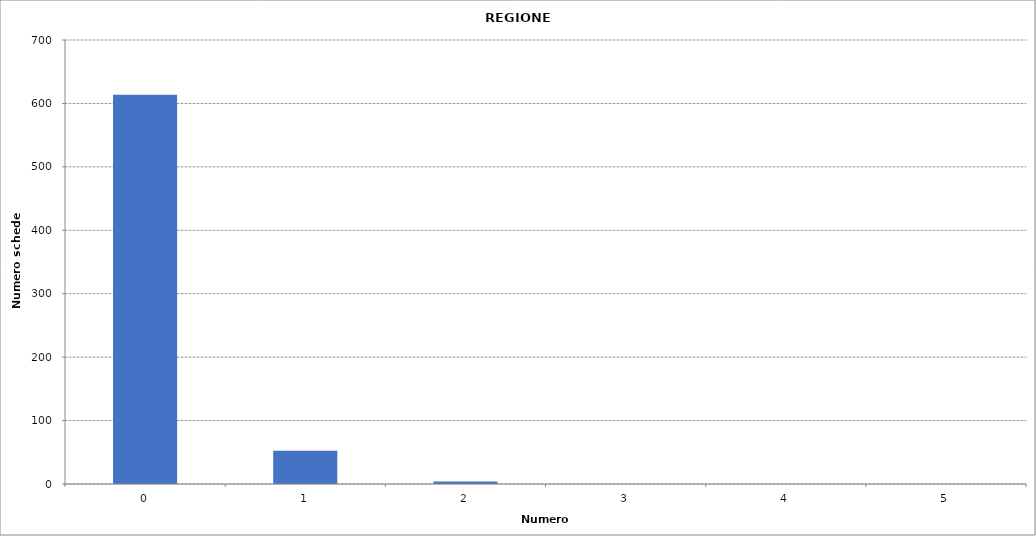
| Category | Series 0 |
|---|---|
| 0.0 | 613695 |
| 1.0 | 52427 |
| 2.0 | 4063 |
| 3.0 | 184 |
| 4.0 | 17 |
| 5.0 | 1 |